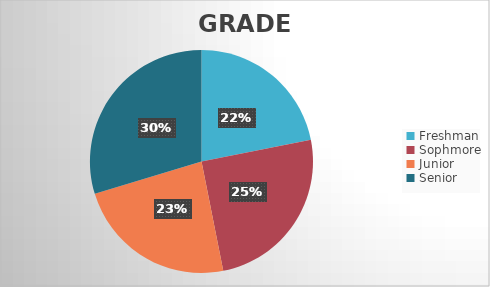
| Category | Series 0 |
|---|---|
| Freshman | 14 |
| Sophmore | 16 |
| Junior | 15 |
| Senior | 19 |